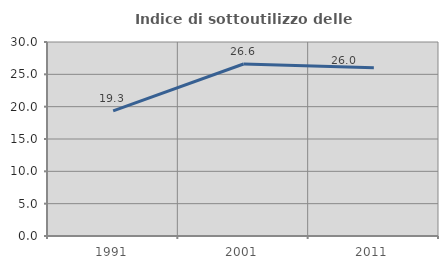
| Category | Indice di sottoutilizzo delle abitazioni  |
|---|---|
| 1991.0 | 19.338 |
| 2001.0 | 26.598 |
| 2011.0 | 26.012 |